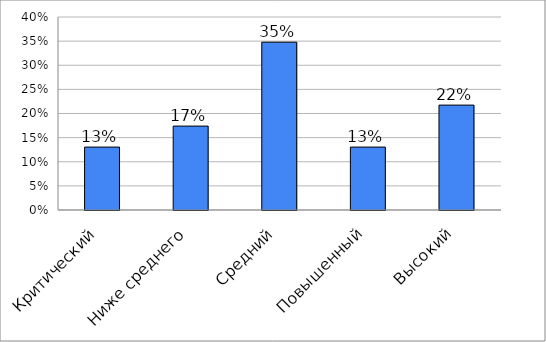
| Category | Series 0 |
|---|---|
| Критический | 0.13 |
| Ниже среднего | 0.174 |
| Средний | 0.348 |
| Повышенный | 0.13 |
| Высокий | 0.217 |